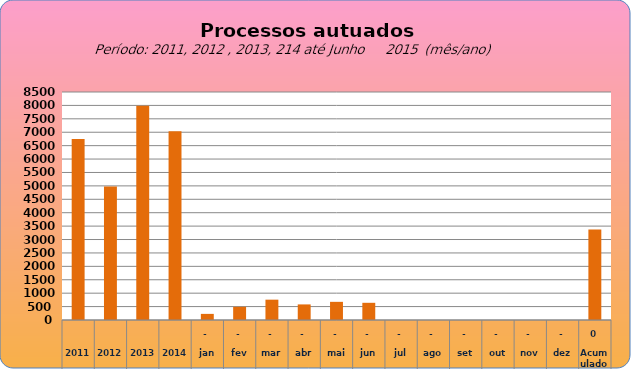
| Category | 6749 4978 7990 7034  228   486   758   581   676   641   -     -     -     -     -     -     3.370  |
|---|---|
| 2011 | 6749 |
| 2012 | 4998 |
| 2013 | 8003 |
| 2014 | 7049 |
| jan | 228 |
| fev | 492 |
| mar | 766 |
| abr | 585 |
| mai | 677 |
| jun | 641 |
| jul | 0 |
| ago | 0 |
| set | 0 |
| out | 0 |
| nov | 0 |
| dez | 0 |
| Acumulado
 | 3389 |